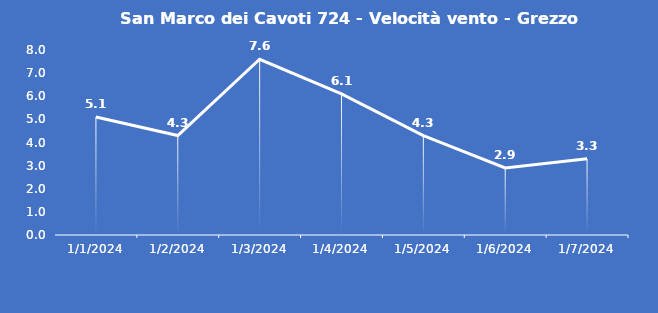
| Category | San Marco dei Cavoti 724 - Velocità vento - Grezzo (m/s) |
|---|---|
| 1/1/24 | 5.1 |
| 1/2/24 | 4.3 |
| 1/3/24 | 7.6 |
| 1/4/24 | 6.1 |
| 1/5/24 | 4.3 |
| 1/6/24 | 2.9 |
| 1/7/24 | 3.3 |